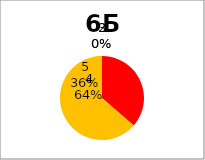
| Category | Series 0 |
|---|---|
| 5.0 | 4 |
| 4.0 | 7 |
| 3.0 | 0 |
| 2.0 | 0 |